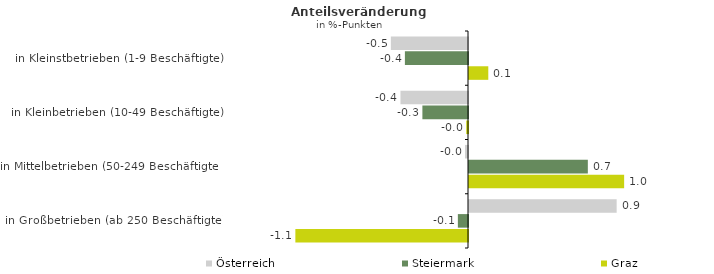
| Category | Österreich | Steiermark | Graz |
|---|---|---|---|
| in Kleinstbetrieben (1-9 Beschäftigte) | -0.48 | -0.393 | 0.12 |
| in Kleinbetrieben (10-49 Beschäftigte) | -0.42 | -0.284 | -0.011 |
| in Mittelbetrieben (50-249 Beschäftigte) | -0.019 | 0.74 | 0.966 |
| in Großbetrieben (ab 250 Beschäftigte) | 0.919 | -0.063 | -1.074 |